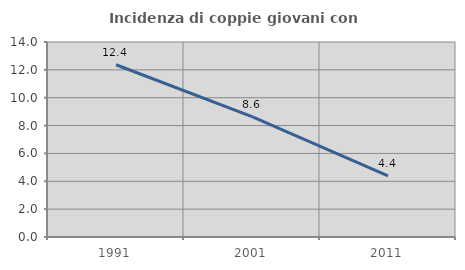
| Category | Incidenza di coppie giovani con figli |
|---|---|
| 1991.0 | 12.366 |
| 2001.0 | 8.636 |
| 2011.0 | 4.386 |